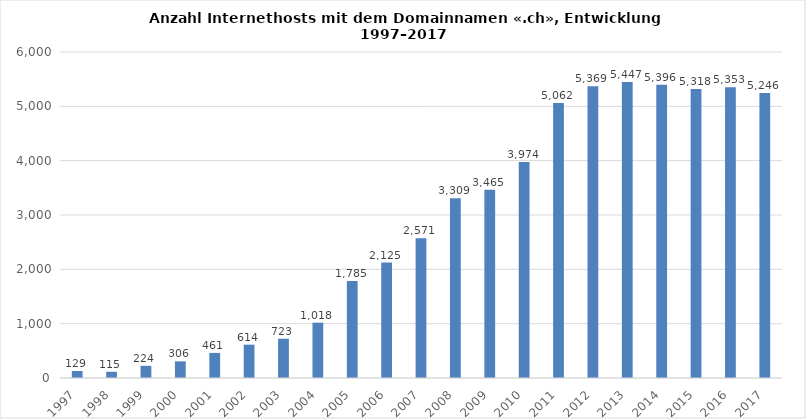
| Category | Hosts, in Tausend |
|---|---|
| 1997.0 | 129.114 |
| 1998.0 | 114.816 |
| 1999.0 | 224.35 |
| 2000.0 | 306.073 |
| 2001.0 | 461.456 |
| 2002.0 | 613.918 |
| 2003.0 | 723 |
| 2004.0 | 1018 |
| 2005.0 | 1785 |
| 2006.0 | 2125.269 |
| 2007.0 | 2570.891 |
| 2008.0 | 3308.684 |
| 2009.0 | 3464.568 |
| 2010.0 | 3974.072 |
| 2011.0 | 5062.397 |
| 2012.0 | 5369.224 |
| 2013.0 | 5446.71 |
| 2014.0 | 5396.243 |
| 2015.0 | 5318.294 |
| 2016.0 | 5353.267 |
| 2017.0 | 5245.555 |